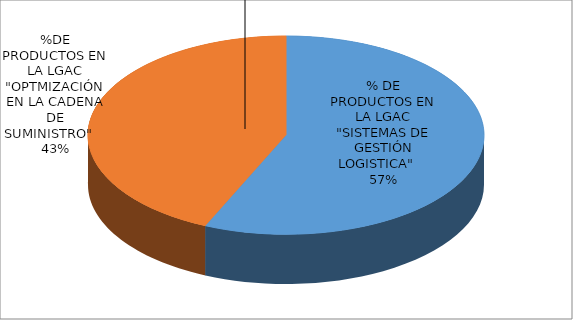
| Category | Series 0 |
|---|---|
| % DE PRODUCTOS EN LA LGAC "SISTEMAS DE GESTIÓN LOGISTICA"    | 0.567 |
| %DE PRODUCTOS EN LA LGAC "OPTMIZACIÓN EN LA CADENA DE SUMINISTRO"    | 0.433 |